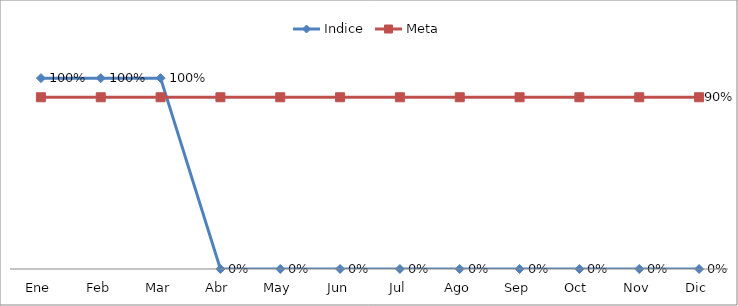
| Category | Indice | Meta |
|---|---|---|
| Ene | 1 | 0.9 |
| Feb | 1 | 0.9 |
| Mar | 1 | 0.9 |
| Abr | 0 | 0.9 |
| May | 0 | 0.9 |
| Jun | 0 | 0.9 |
| Jul | 0 | 0.9 |
| Ago | 0 | 0.9 |
| Sep | 0 | 0.9 |
| Oct | 0 | 0.9 |
| Nov | 0 | 0.9 |
| Dic | 0 | 0.9 |